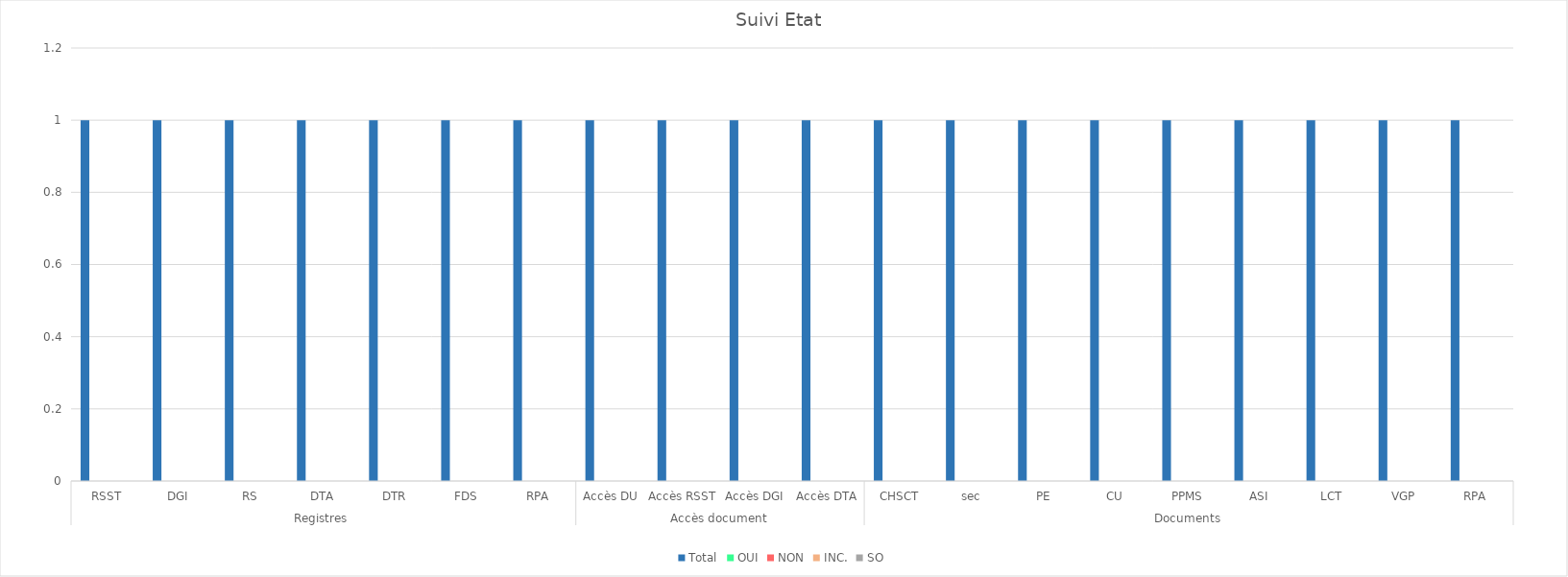
| Category | Total | OUI | NON | INC. | SO |
|---|---|---|---|---|---|
| 0 | 1 | 0 | 0 | 0 | 0 |
| 1 | 1 | 0 | 0 | 0 | 0 |
| 2 | 1 | 0 | 0 | 0 | 0 |
| 3 | 1 | 0 | 0 | 0 | 0 |
| 4 | 1 | 0 | 0 | 0 | 0 |
| 5 | 1 | 0 | 0 | 0 | 0 |
| 6 | 1 | 0 | 0 | 0 | 0 |
| 7 | 1 | 0 | 0 | 0 | 0 |
| 8 | 1 | 0 | 0 | 0 | 0 |
| 9 | 1 | 0 | 0 | 0 | 0 |
| 10 | 1 | 0 | 0 | 0 | 0 |
| 11 | 1 | 0 | 0 | 0 | 0 |
| 12 | 1 | 0 | 0 | 0 | 0 |
| 13 | 1 | 0 | 0 | 0 | 0 |
| 14 | 1 | 0 | 0 | 0 | 0 |
| 15 | 1 | 0 | 0 | 0 | 0 |
| 16 | 1 | 0 | 0 | 0 | 0 |
| 17 | 1 | 0 | 0 | 0 | 0 |
| 18 | 1 | 0 | 0 | 0 | 0 |
| 19 | 1 | 0 | 0 | 0 | 0 |